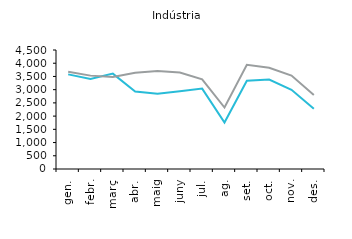
| Category | 2015 | 2016 |
|---|---|---|
| gen. | 3578 | 3681 |
| febr. | 3403 | 3531 |
| març | 3607 | 3479 |
| abr. | 2928 | 3637 |
| maig | 2844 | 3702 |
| juny | 2937 | 3647 |
| jul. | 3041 | 3392 |
| ag. | 1756 | 2325 |
| set. | 3339 | 3938 |
| oct. | 3383 | 3830 |
| nov. | 2996 | 3534 |
| des. | 2280 | 2796 |